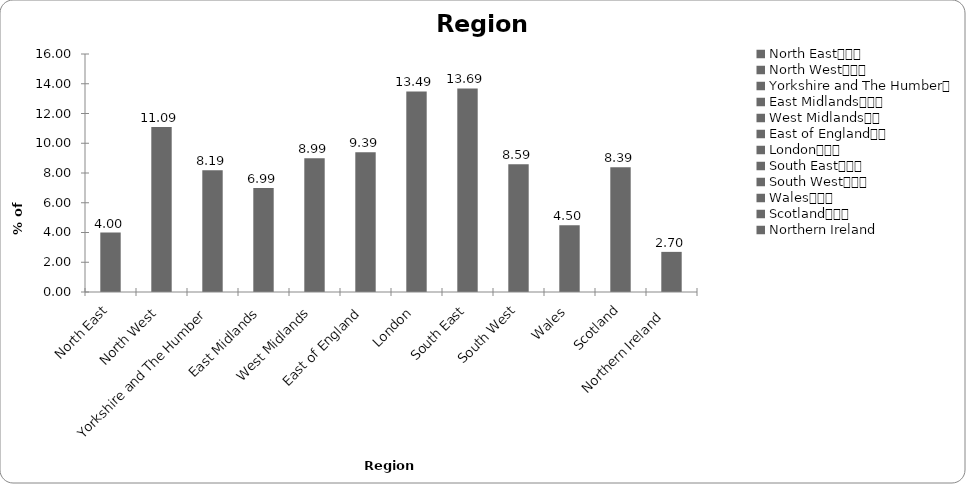
| Category | Region |
|---|---|
| North East			 | 3.996 |
| North West			 | 11.089 |
| Yorkshire and The Humber	 | 8.192 |
| East Midlands			 | 6.993 |
| West Midlands		 | 8.991 |
| East of England		 | 9.391 |
| London			 | 13.487 |
| South East			 | 13.686 |
| South West			 | 8.591 |
| Wales			 | 4.496 |
| Scotland			 | 8.392 |
| Northern Ireland  | 2.697 |